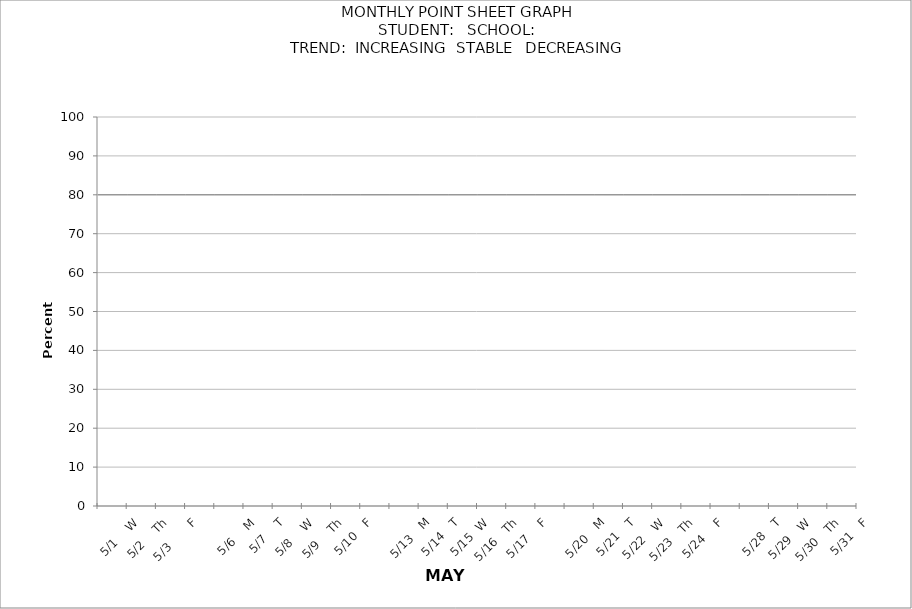
| Category | PERCENTAGE | target |
|---|---|---|
|  |  | 80 |
| 5/1    W |  | 80 |
| 5/2    Th |  | 80 |
| 5/3       F |  | 80 |
|  |  | 80 |
| 5/6    M |  | 80 |
| 5/7    T |  | 80 |
| 5/8    W |  | 80 |
| 5/9    Th |  | 80 |
| 5/10   F |  | 80 |
|  |  | 80 |
| 5/13   M |  | 80 |
| 5/14   T |  | 80 |
| 5/15  W |  | 80 |
| 5/16   Th |  | 80 |
| 5/17    F |  | 80 |
|  |  | 80 |
| 5/20   M |  | 80 |
| 5/21   T |  | 80 |
| 5/22   W |  | 80 |
| 5/23   Th |  | 80 |
| 5/24    F |  | 80 |
|  |  | 80 |
| 5/28   T |  | 80 |
| 5/29   W |  | 80 |
| 5/30   Th |  | 80 |
| 5/31   F |  | 80 |